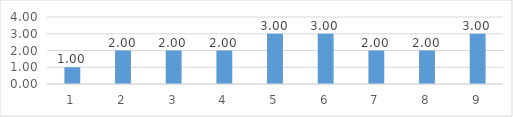
| Category | Series 0 |
|---|---|
| 0 | 1 |
| 1 | 2 |
| 2 | 2 |
| 3 | 2 |
| 4 | 3 |
| 5 | 3 |
| 6 | 2 |
| 7 | 2 |
| 8 | 3 |